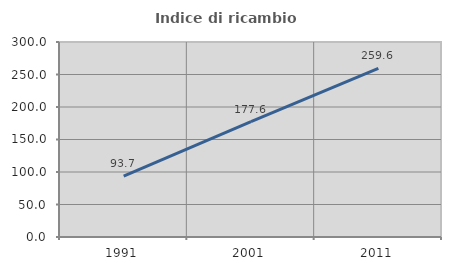
| Category | Indice di ricambio occupazionale  |
|---|---|
| 1991.0 | 93.721 |
| 2001.0 | 177.643 |
| 2011.0 | 259.588 |